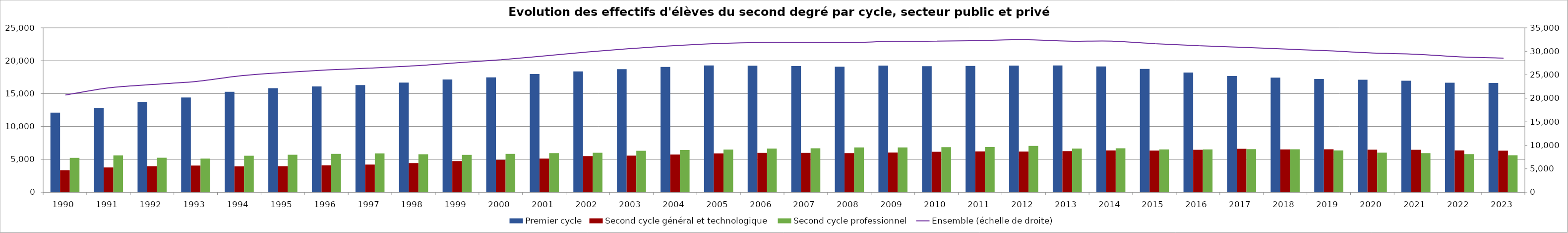
| Category | Premier cycle | Second cycle général et technologique | Second cycle professionnel |
|---|---|---|---|
| 1990.0 | 12097 | 3356 | 5235 |
| 1991.0 | 12843 | 3772 | 5613 |
| 1992.0 | 13750 | 3958 | 5240 |
| 1993.0 | 14409 | 4057 | 5109 |
| 1994.0 | 15270 | 3945 | 5558 |
| 1995.0 | 15828 | 3960 | 5693 |
| 1996.0 | 16092 | 4099 | 5836 |
| 1997.0 | 16304 | 4213 | 5919 |
| 1998.0 | 16679 | 4446 | 5777 |
| 1999.0 | 17143 | 4738 | 5691 |
| 2000.0 | 17467 | 4920 | 5829 |
| 2001.0 | 17975 | 5109 | 5952 |
| 2002.0 | 18375 | 5486 | 6006 |
| 2003.0 | 18720 | 5579 | 6300 |
| 2004.0 | 19060 | 5744 | 6426 |
| 2005.0 | 19280 | 5903 | 6496 |
| 2006.0 | 19250 | 5988 | 6651 |
| 2007.0 | 19192 | 5988 | 6693 |
| 2008.0 | 19094 | 5951 | 6812 |
| 2009.0 | 19259 | 6051 | 6825 |
| 2010.0 | 19162 | 6150 | 6847 |
| 2011.0 | 19197 | 6209 | 6873 |
| 2012.0 | 19256 | 6184 | 7046 |
| 2013.0 | 19275 | 6244 | 6640 |
| 2014.0 | 19135 | 6356 | 6693 |
| 2015.0 | 18759 | 6350 | 6520 |
| 2016.0 | 18202 | 6462 | 6518 |
| 2017.0 | 17677 | 6617 | 6548 |
| 2018.0 | 17435 | 6515 | 6524 |
| 2019.0 | 17213 | 6531 | 6358 |
| 2020.0 | 17105 | 6486 | 6031 |
| 2021.0 | 16965 | 6462 | 5953 |
| 2022.0 | 16655 | 6368 | 5790 |
| 2023.0 | 16618 | 6323 | 5619 |